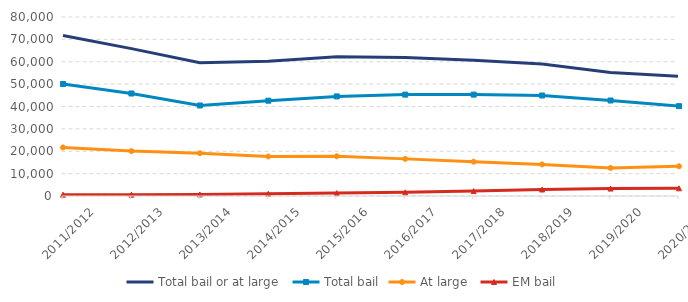
| Category | Total bail or at large | Total bail | At large | EM bail |
|---|---|---|---|---|
| 2011/2012 | 71739 | 50038 | 21701 | 604 |
| 2012/2013 | 65872 | 45809 | 20063 | 605 |
| 2013/2014 | 59584 | 40454 | 19130 | 691 |
| 2014/2015 | 60258 | 42599 | 17659 | 1020 |
| 2015/2016 | 62251 | 44505 | 17746 | 1286 |
| 2016/2017 | 61906 | 45314 | 16592 | 1623 |
| 2017/2018 | 60644 | 45316 | 15328 | 2208 |
| 2018/2019 | 59033 | 44917 | 14116 | 2900 |
| 2019/2020 | 55227 | 42686 | 12541 | 3325 |
| 2020/2021 | 53447 | 40160 | 13287 | 3446 |